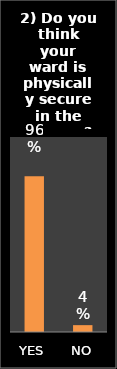
| Category | Series 0 |
|---|---|
| YES | 0.958 |
| NO | 0.042 |